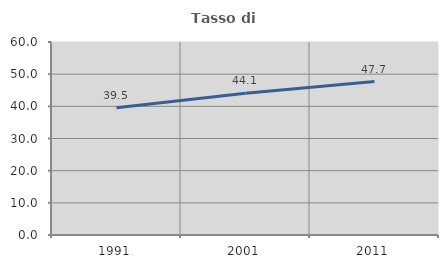
| Category | Tasso di occupazione   |
|---|---|
| 1991.0 | 39.537 |
| 2001.0 | 44.095 |
| 2011.0 | 47.692 |